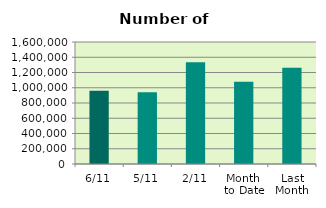
| Category | Series 0 |
|---|---|
| 6/11 | 959026 |
| 5/11 | 941846 |
| 2/11 | 1334852 |
| Month 
to Date | 1078602.5 |
| Last
Month | 1260789.391 |